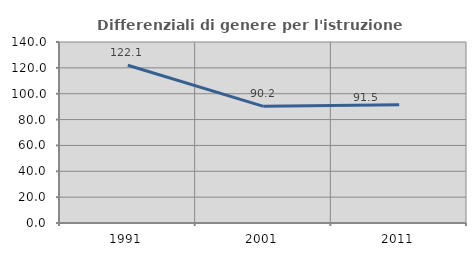
| Category | Differenziali di genere per l'istruzione superiore |
|---|---|
| 1991.0 | 122.059 |
| 2001.0 | 90.214 |
| 2011.0 | 91.506 |